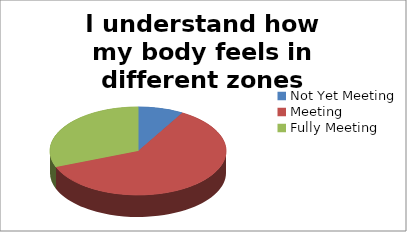
| Category | I understand how my body feels in different zones |
|---|---|
| Not Yet Meeting | 7 |
| Meeting | 51 |
| Fully Meeting | 26 |